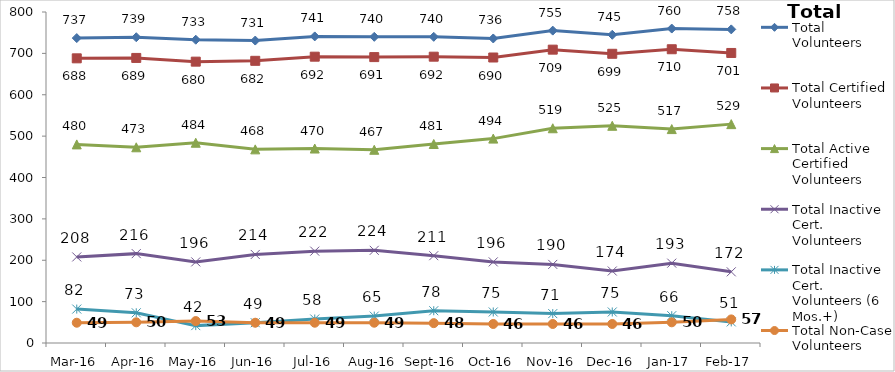
| Category | Total Volunteers | Total Certified Volunteers | Total Active Certified Volunteers | Total Inactive Cert. Volunteers | Total Inactive Cert. Volunteers (6 Mos.+) | Total Non-Case Volunteers |
|---|---|---|---|---|---|---|
| Mar-16 | 737 | 688 | 480 | 208 | 82 | 49 |
| Apr-16 | 739 | 689 | 473 | 216 | 73 | 50 |
| May-16 | 733 | 680 | 484 | 196 | 42 | 53 |
| Jun-16 | 731 | 682 | 468 | 214 | 49 | 49 |
| Jul-16 | 741 | 692 | 470 | 222 | 58 | 49 |
| Aug-16 | 740 | 691 | 467 | 224 | 65 | 49 |
| Sep-16 | 740 | 692 | 481 | 211 | 78 | 48 |
| Oct-16 | 736 | 690 | 494 | 196 | 75 | 46 |
| Nov-16 | 755 | 709 | 519 | 190 | 71 | 46 |
| Dec-16 | 745 | 699 | 525 | 174 | 75 | 46 |
| Jan-17 | 760 | 710 | 517 | 193 | 66 | 50 |
| Feb-17 | 758 | 701 | 529 | 172 | 51 | 57 |